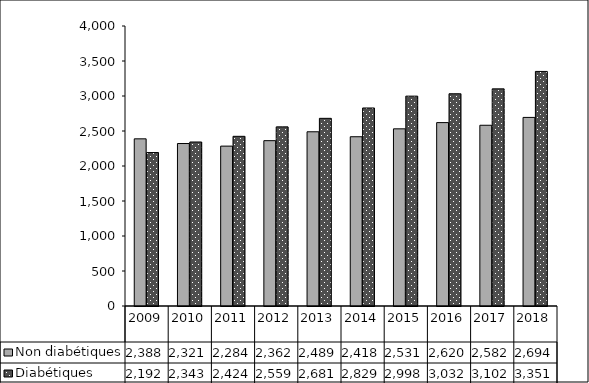
| Category | Non diabétiques | Diabétiques |
|---|---|---|
| 2009.0 | 2388 | 2192 |
| 2010.0 | 2321 | 2343 |
| 2011.0 | 2284 | 2424 |
| 2012.0 | 2362 | 2559 |
| 2013.0 | 2489 | 2681 |
| 2014.0 | 2418 | 2829 |
| 2015.0 | 2531 | 2998 |
| 2016.0 | 2620 | 3032 |
| 2017.0 | 2582 | 3102 |
| 2018.0 | 2694 | 3351 |